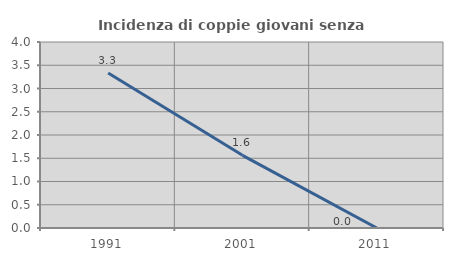
| Category | Incidenza di coppie giovani senza figli |
|---|---|
| 1991.0 | 3.333 |
| 2001.0 | 1.562 |
| 2011.0 | 0 |